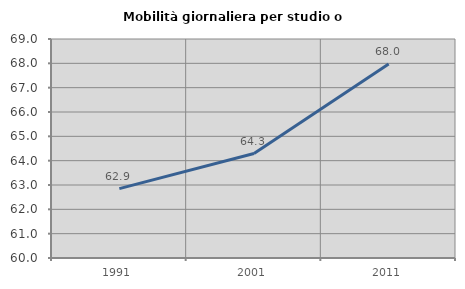
| Category | Mobilità giornaliera per studio o lavoro |
|---|---|
| 1991.0 | 62.85 |
| 2001.0 | 64.293 |
| 2011.0 | 67.969 |